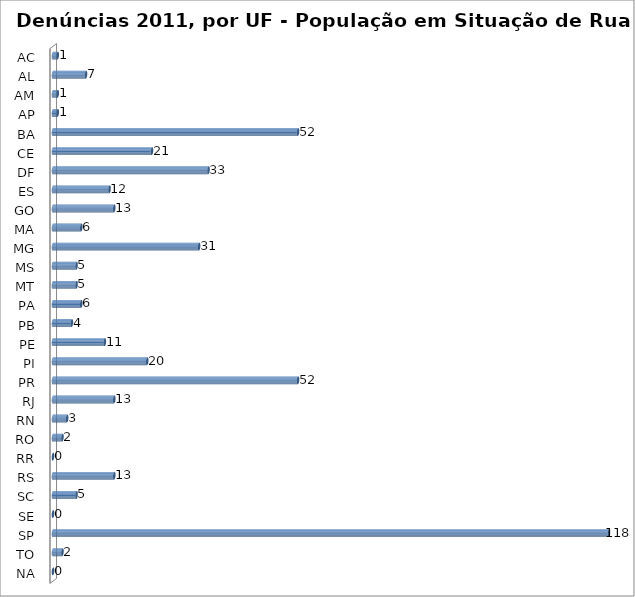
| Category | Series 0 |
|---|---|
| AC | 1 |
| AL | 7 |
| AM | 1 |
| AP | 1 |
| BA | 52 |
| CE | 21 |
| DF | 33 |
| ES | 12 |
| GO | 13 |
| MA | 6 |
| MG | 31 |
| MS | 5 |
| MT | 5 |
| PA | 6 |
| PB | 4 |
| PE | 11 |
| PI | 20 |
| PR | 52 |
| RJ | 13 |
| RN | 3 |
| RO | 2 |
| RR | 0 |
| RS | 13 |
| SC | 5 |
| SE | 0 |
| SP | 118 |
| TO | 2 |
| NA | 0 |